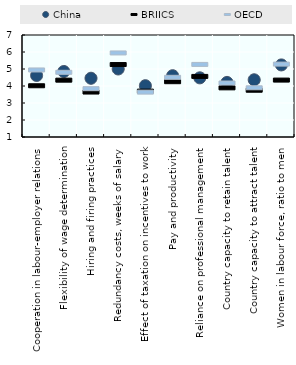
| Category | China | BRIICS | OECD |
|---|---|---|---|
| Cooperation in labour-employer relations | 4.619 | 4.014 | 4.944 |
| Flexibility of wage determination | 4.853 | 4.344 | 4.805 |
| Hiring and firing practices | 4.455 | 3.644 | 3.843 |
| Redundancy costs, weeks of salary | 5.002 | 5.262 | 5.944 |
| Effect of taxation on incentives to work | 4.018 | 3.699 | 3.64 |
| Pay and productivity | 4.606 | 4.253 | 4.512 |
| Reliance on professional management | 4.481 | 4.564 | 5.27 |
| Country capacity to retain talent | 4.211 | 3.891 | 4.176 |
| Country capacity to attract talent | 4.365 | 3.751 | 3.895 |
| Women in labour force, ratio to men | 5.24 | 4.348 | 5.288 |